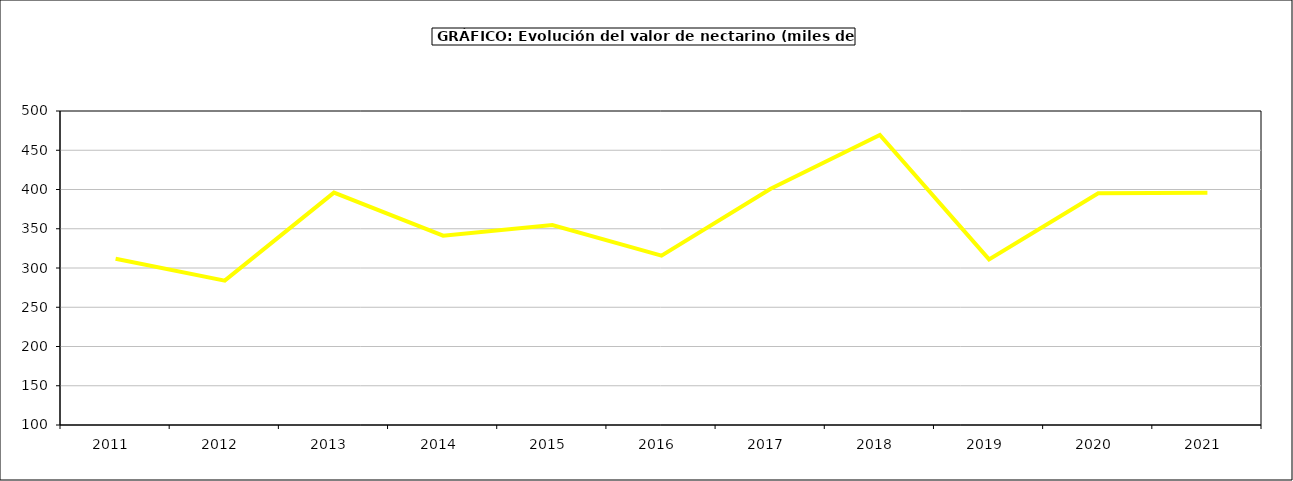
| Category | valor melocotonero |
|---|---|
| 2011.0 | 311.892 |
| 2012.0 | 283.963 |
| 2013.0 | 395.996 |
| 2014.0 | 341.206 |
| 2015.0 | 354.8 |
| 2016.0 | 315.7 |
| 2017.0 | 400.939 |
| 2018.0 | 469.428 |
| 2019.0 | 310.904 |
| 2020.0 | 395.161 |
| 2021.0 | 395.777 |